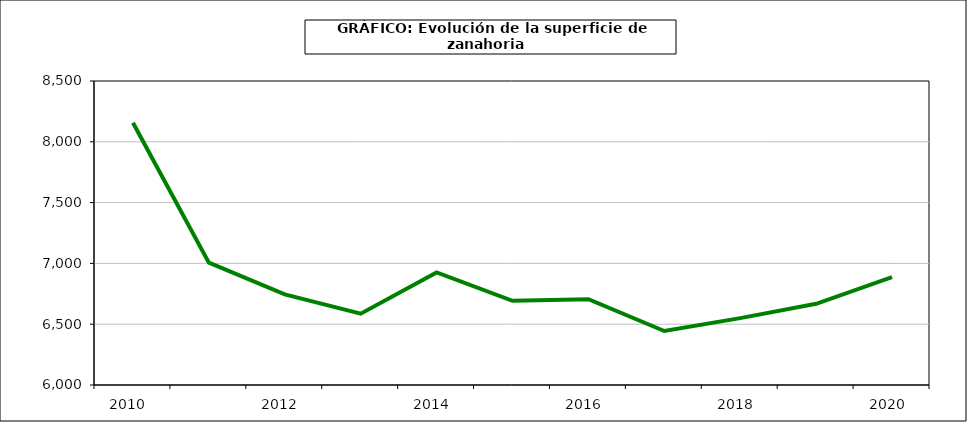
| Category | superficie |
|---|---|
| 2010.0 | 8157 |
| 2011.0 | 7006 |
| 2012.0 | 6745 |
| 2013.0 | 6586 |
| 2014.0 | 6926 |
| 2015.0 | 6692 |
| 2016.0 | 6705 |
| 2017.0 | 6444 |
| 2018.0 | 6550 |
| 2019.0 | 6668 |
| 2020.0 | 6888 |